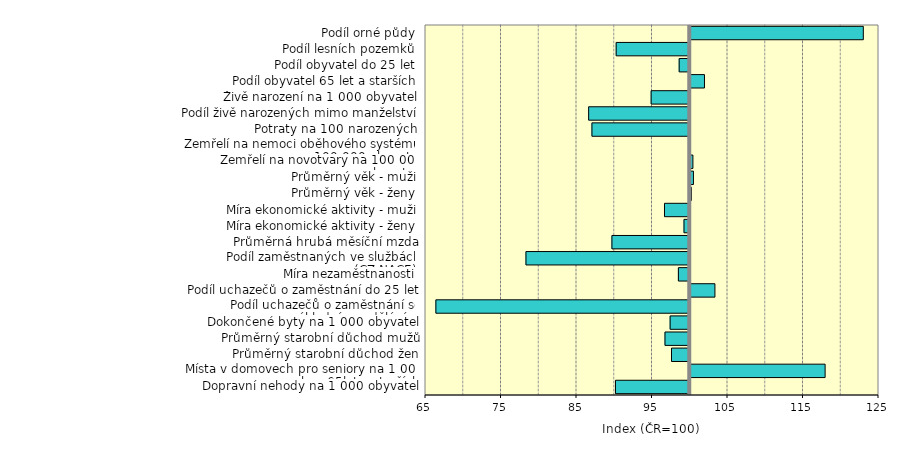
| Category | Series 0 |
|---|---|
| Dopravní nehody na 1 000 obyvatel | 90.161 |
| Místa v domovech pro seniory na 1 000 obyv 65let a starších | 117.862 |
| Průměrný starobní důchod žen | 97.583 |
| Průměrný starobní důchod mužů | 96.721 |
| Dokončené byty na 1 000 obyvatel | 97.402 |
| Podíl uchazečů o zaměstnání se základním vzděláním | 66.376 |
| Podíl uchazečů o zaměstnání do 25 let | 103.27 |
| Míra nezaměstnanosti | 98.496 |
| Podíl zaměstnaných ve službách (CZ-NACE) | 78.307 |
| Průměrná hrubá měsíční mzda | 89.692 |
| Míra ekonomické aktivity - ženy | 99.238 |
| Míra ekonomické aktivity - muži | 96.655 |
| Průměrný věk - ženy | 100.14 |
| Průměrný věk - muži | 100.421 |
| Zemřelí na novotvary na 100 000 obyvatel | 100.352 |
| Zemřelí na nemoci oběhového systému na 100 000 obyvatel | 99.855 |
| Potraty na 100 narozených | 87.045 |
| Podíl živě narozených mimo manželství | 86.609 |
| Živě narození na 1 000 obyvatel | 94.888 |
| Podíl obyvatel 65 let a starších | 101.885 |
| Podíl obyvatel do 25 let | 98.6 |
| Podíl lesních pozemků | 90.256 |
| Podíl orné půdy | 122.924 |